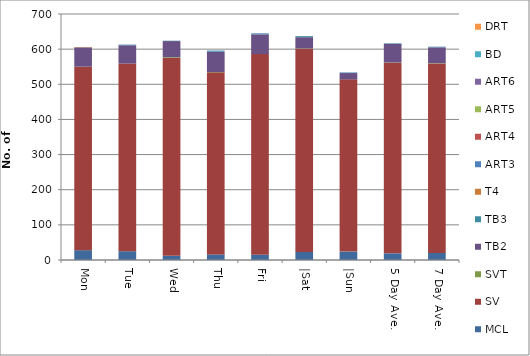
| Category | MCL | SV | SVT | TB2 | TB3 | T4 | ART3 | ART4 | ART5 | ART6 | BD | DRT |
|---|---|---|---|---|---|---|---|---|---|---|---|---|
| Mon | 28 | 522 | 0 | 55 | 0 | 1 | 0 | 0 | 0 | 0 | 0 | 0 |
| Tue | 25 | 534 | 0 | 52 | 1 | 0 | 1 | 0 | 0 | 0 | 0 | 0 |
| Wed | 12 | 563 | 2 | 46 | 1 | 0 | 0 | 0 | 0 | 0 | 0 | 0 |
| Thu | 16 | 518 | 1 | 57 | 2 | 0 | 2 | 0 | 0 | 0 | 0 | 0 |
| Fri | 15 | 571 | 0 | 56 | 1 | 0 | 2 | 0 | 0 | 0 | 0 | 0 |
| |Sat | 23 | 578 | 1 | 32 | 3 | 0 | 0 | 0 | 0 | 0 | 0 | 0 |
| |Sun | 24 | 490 | 0 | 18 | 1 | 0 | 1 | 0 | 0 | 0 | 0 | 0 |
| 5 Day Ave. | 19 | 542 | 1 | 53 | 1 | 0 | 1 | 0 | 0 | 0 | 0 | 0 |
| 7 Day Ave. | 20 | 539 | 1 | 45 | 1 | 0 | 1 | 0 | 0 | 0 | 0 | 0 |